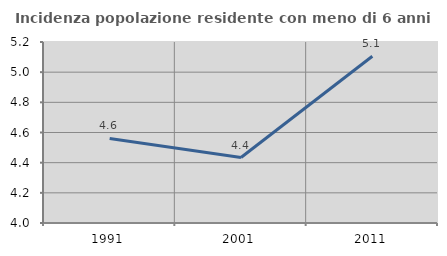
| Category | Incidenza popolazione residente con meno di 6 anni |
|---|---|
| 1991.0 | 4.56 |
| 2001.0 | 4.434 |
| 2011.0 | 5.105 |